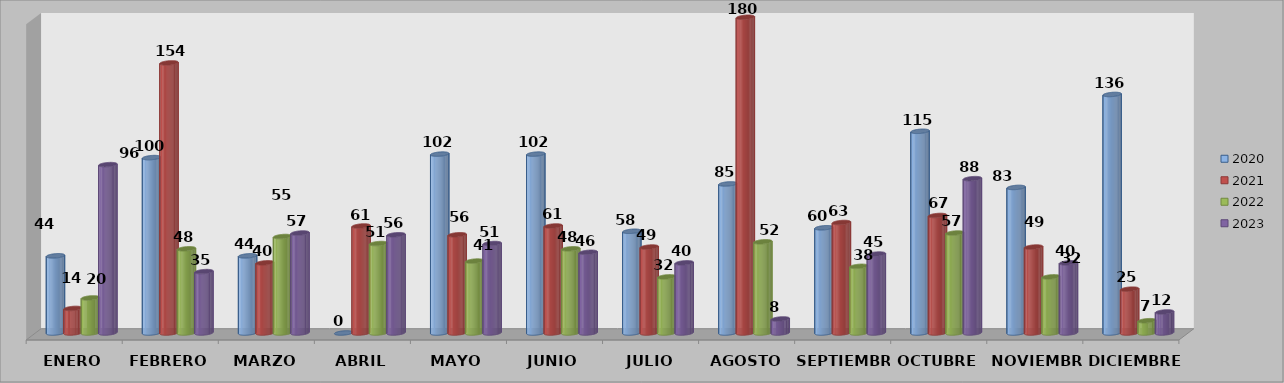
| Category | 2020 | 2021 | 2022 | 2023 |
|---|---|---|---|---|
| ENERO | 44 | 14 | 20 | 96 |
| FEBRERO | 100 | 154 | 48 | 35 |
| MARZO | 44 | 40 | 55 | 57 |
| ABRIL | 0 | 61 | 51 | 56 |
| MAYO | 102 | 56 | 41 | 51 |
| JUNIO | 102 | 61 | 48 | 46 |
| JULIO | 58 | 49 | 32 | 40 |
| AGOSTO | 85 | 180 | 52 | 8 |
| SEPTIEMBRE | 60 | 63 | 38 | 45 |
| OCTUBRE | 115 | 67 | 57 | 88 |
| NOVIEMBRE | 83 | 49 | 32 | 40 |
| DICIEMBRE | 136 | 25 | 7 | 12 |